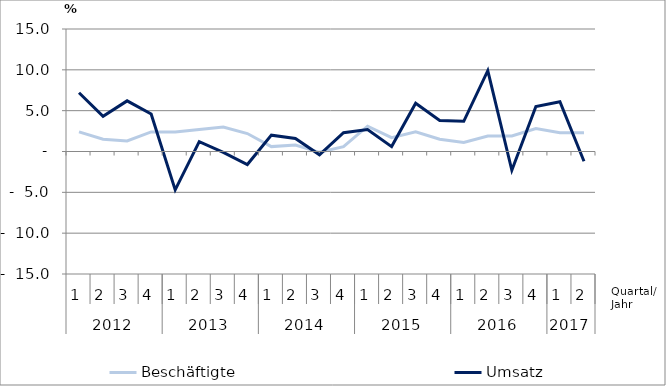
| Category | Beschäftigte | Umsatz |
|---|---|---|
| 0 | 2.4 | 7.2 |
| 1 | 1.5 | 4.3 |
| 2 | 1.3 | 6.2 |
| 3 | 2.4 | 4.6 |
| 4 | 2.4 | -4.7 |
| 5 | 2.7 | 1.2 |
| 6 | 3 | -0.1 |
| 7 | 2.2 | -1.6 |
| 8 | 0.6 | 2 |
| 9 | 0.8 | 1.6 |
| 10 | -0.1 | -0.4 |
| 11 | 0.6 | 2.3 |
| 12 | 3.1 | 2.7 |
| 13 | 1.7 | 0.6 |
| 14 | 2.4 | 5.9 |
| 15 | 1.5 | 3.8 |
| 16 | 1.1 | 3.7 |
| 17 | 1.9 | 9.9 |
| 18 | 1.9 | -2.3 |
| 19 | 2.8 | 5.5 |
| 20 | 2.3 | 6.1 |
| 21 | 2.3 | -1.2 |